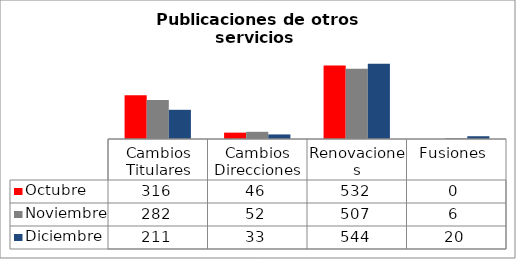
| Category | Octubre | Noviembre | Diciembre |
|---|---|---|---|
| Cambios Titulares | 316 | 282 | 211 |
| Cambios Direcciones | 46 | 52 | 33 |
| Renovaciones | 532 | 507 | 544 |
| Fusiones  | 0 | 6 | 20 |